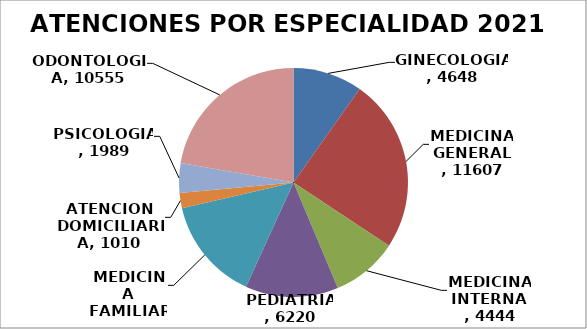
| Category | TOTAL |
|---|---|
| GINECOLOGIA | 4648 |
| MEDICINA GENERAL  | 11607 |
| MEDICINA INTERNA   | 4444 |
| PEDIATRIA | 6220 |
| MEDICINA FAMILIAR | 6913 |
| ATENCION DOMICILIARIA | 1010 |
| PSICOLOGIA | 1989 |
| ODONTOLOGIA | 10555 |